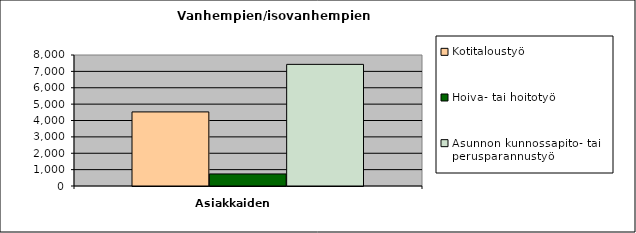
| Category | Kotitaloustyö | Hoiva- tai hoitotyö | Asunnon kunnossapito- tai perusparannustyö |
|---|---|---|---|
| 0 | 4524 | 736 | 7428 |